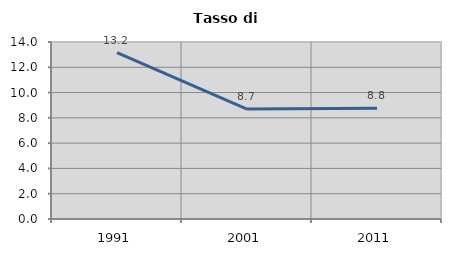
| Category | Tasso di disoccupazione   |
|---|---|
| 1991.0 | 13.153 |
| 2001.0 | 8.696 |
| 2011.0 | 8.76 |